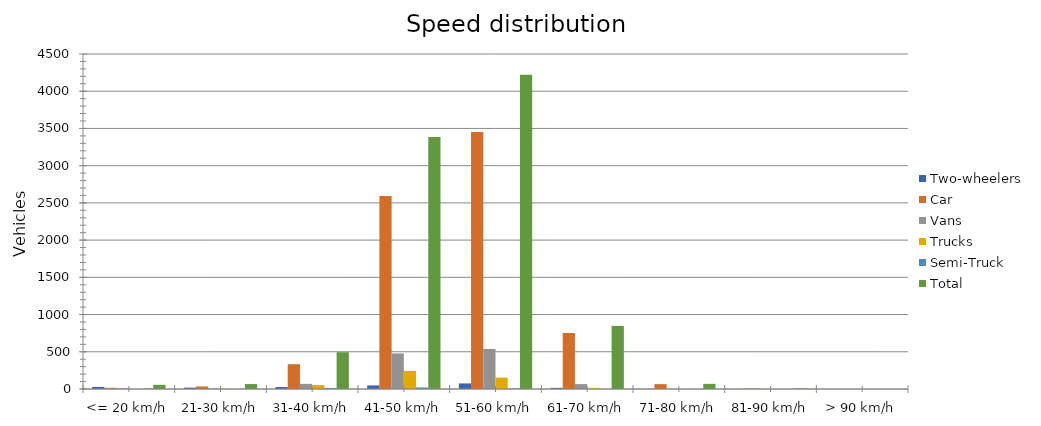
| Category | Two-wheelers | Car | Vans | Trucks | Semi-Truck | Total |
|---|---|---|---|---|---|---|
| <= 20 km/h | 28 | 16 | 6 | 2 | 4 | 56 |
| 21-30 km/h | 18 | 34 | 6 | 6 | 2 | 66 |
| 31-40 km/h | 27 | 333 | 69 | 53 | 12 | 494 |
| 41-50 km/h | 48 | 2594 | 478 | 243 | 21 | 3384 |
| 51-60 km/h | 75 | 3452 | 537 | 153 | 4 | 4221 |
| 61-70 km/h | 15 | 752 | 66 | 15 | 0 | 848 |
| 71-80 km/h | 2 | 65 | 1 | 1 | 0 | 69 |
| 81-90 km/h | 1 | 6 | 1 | 0 | 0 | 8 |
| > 90 km/h | 0 | 1 | 1 | 0 | 0 | 2 |